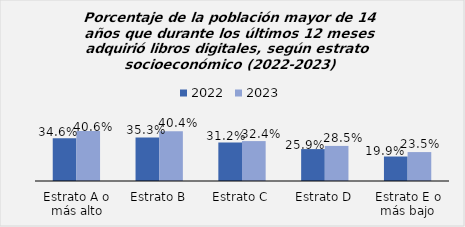
| Category | 2022 | 2023 |
|---|---|---|
| Estrato A o más alto | 0.346 | 0.406 |
| Estrato B | 0.352 | 0.404 |
| Estrato C | 0.312 | 0.324 |
| Estrato D | 0.259 | 0.284 |
| Estrato E o más bajo | 0.198 | 0.234 |